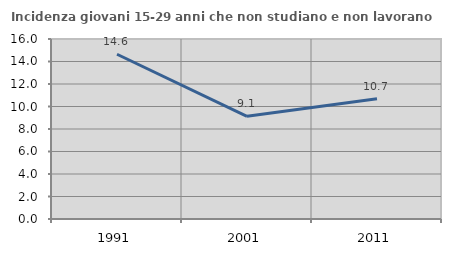
| Category | Incidenza giovani 15-29 anni che non studiano e non lavorano  |
|---|---|
| 1991.0 | 14.645 |
| 2001.0 | 9.129 |
| 2011.0 | 10.689 |